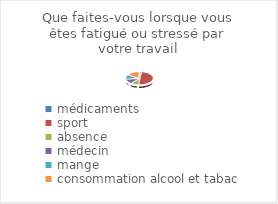
| Category | Que faites-vous lorsque vous êtes fatigué ou stressé par votre travail |
|---|---|
| médicaments | 4 |
| sport | 46 |
| absence | 10 |
| médecin | 12 |
| mange | 10 |
| consommation alcool et tabac | 15 |